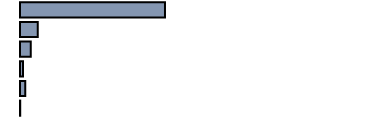
| Category | 49,0 |
|---|---|
| 0 | 40.611 |
| 1 | 5.007 |
| 2 | 3.023 |
| 3 | 0.827 |
| 4 | 1.465 |
| 5 | 0.059 |